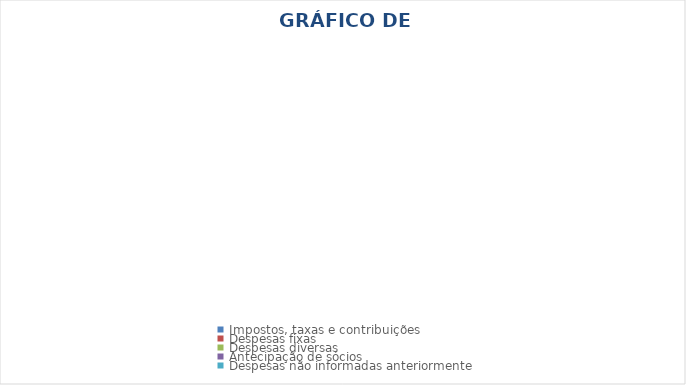
| Category | Series 0 |
|---|---|
| Impostos, taxas e contribuições | 0 |
| Despesas fixas | 0 |
| Despesas diversas | 0 |
| Antecipação de sócios | 0 |
| Despesas não informadas anteriormente | 0 |